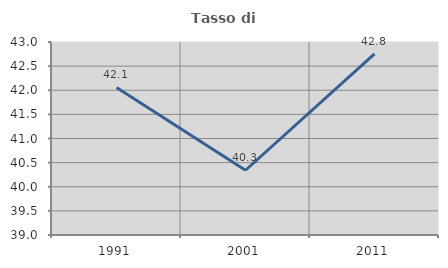
| Category | Tasso di occupazione   |
|---|---|
| 1991.0 | 42.057 |
| 2001.0 | 40.342 |
| 2011.0 | 42.752 |